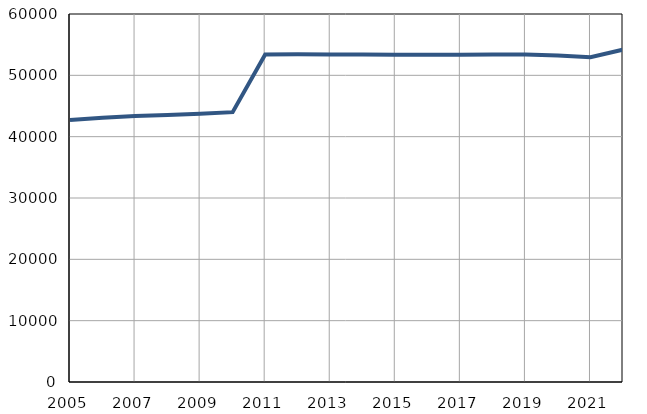
| Category | Број
становника |
|---|---|
| 2005.0 | 42719 |
| 2006.0 | 43069 |
| 2007.0 | 43371 |
| 2008.0 | 43545 |
| 2009.0 | 43750 |
| 2010.0 | 43993 |
| 2011.0 | 53393 |
| 2012.0 | 53424 |
| 2013.0 | 53394 |
| 2014.0 | 53387 |
| 2015.0 | 53351 |
| 2016.0 | 53348 |
| 2017.0 | 53350 |
| 2018.0 | 53377 |
| 2019.0 | 53388 |
| 2020.0 | 53249 |
| 2021.0 | 52958 |
| 2022.0 | 54180 |